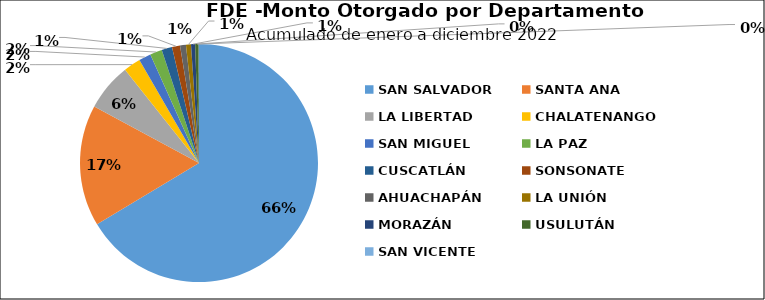
| Category | Monto | Créditos |
|---|---|---|
| SAN SALVADOR | 10.218 | 94 |
| SANTA ANA | 2.538 | 26 |
| LA LIBERTAD | 0.996 | 30 |
| CHALATENANGO | 0.357 | 5 |
| SAN MIGUEL | 0.253 | 23 |
| LA PAZ | 0.252 | 22 |
| CUSCATLÁN | 0.219 | 2 |
| SONSONATE | 0.169 | 12 |
| AHUACHAPÁN | 0.122 | 5 |
| LA UNIÓN | 0.105 | 8 |
| MORAZÁN | 0.086 | 6 |
| USULUTÁN | 0.073 | 8 |
| SAN VICENTE | 0.006 | 1 |